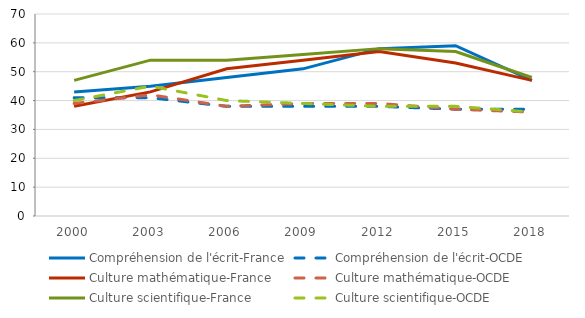
| Category | Compréhension de l'écrit-France | Compréhension de l'écrit-OCDE | Culture mathématique-France | Culture mathématique-OCDE | Culture scientifique-France | Culture scientifique-OCDE |
|---|---|---|---|---|---|---|
| 2000.0 | 43 | 41 | 38 | 39 | 47 | 40 |
| 2003.0 | 45 | 41 | 43 | 42 | 54 | 45 |
| 2006.0 | 48 | 38 | 51 | 38 | 54 | 40 |
| 2009.0 | 51 | 38 | 54 | 39 | 56 | 39 |
| 2012.0 | 58 | 38 | 57 | 39 | 58 | 38 |
| 2015.0 | 59 | 37 | 53 | 37 | 57 | 38 |
| 2018.0 | 47 | 37 | 47 | 36 | 48 | 36 |